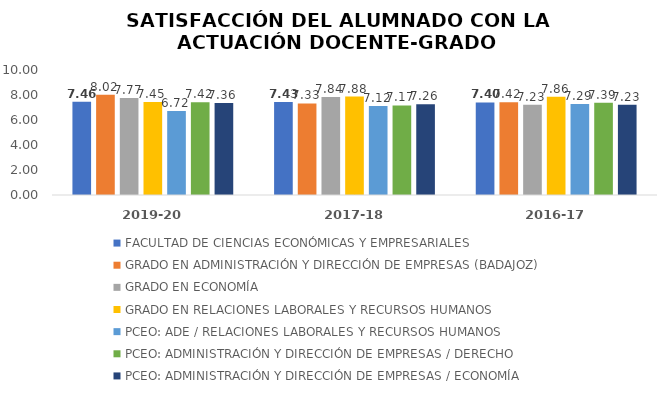
| Category | FACULTAD DE CIENCIAS ECONÓMICAS Y EMPRESARIALES | GRADO EN ADMINISTRACIÓN Y DIRECCIÓN DE EMPRESAS (BADAJOZ) | GRADO EN ECONOMÍA | GRADO EN RELACIONES LABORALES Y RECURSOS HUMANOS | PCEO: ADE / RELACIONES LABORALES Y RECURSOS HUMANOS | PCEO: ADMINISTRACIÓN Y DIRECCIÓN DE EMPRESAS / DERECHO | PCEO: ADMINISTRACIÓN Y DIRECCIÓN DE EMPRESAS / ECONOMÍA |
|---|---|---|---|---|---|---|---|
| 2019-20 | 7.457 | 8.02 | 7.77 | 7.45 | 6.72 | 7.42 | 7.36 |
| 2017-18 | 7.433 | 7.33 | 7.84 | 7.88 | 7.12 | 7.17 | 7.26 |
| 2016-17 | 7.403 | 7.42 | 7.23 | 7.86 | 7.29 | 7.39 | 7.23 |